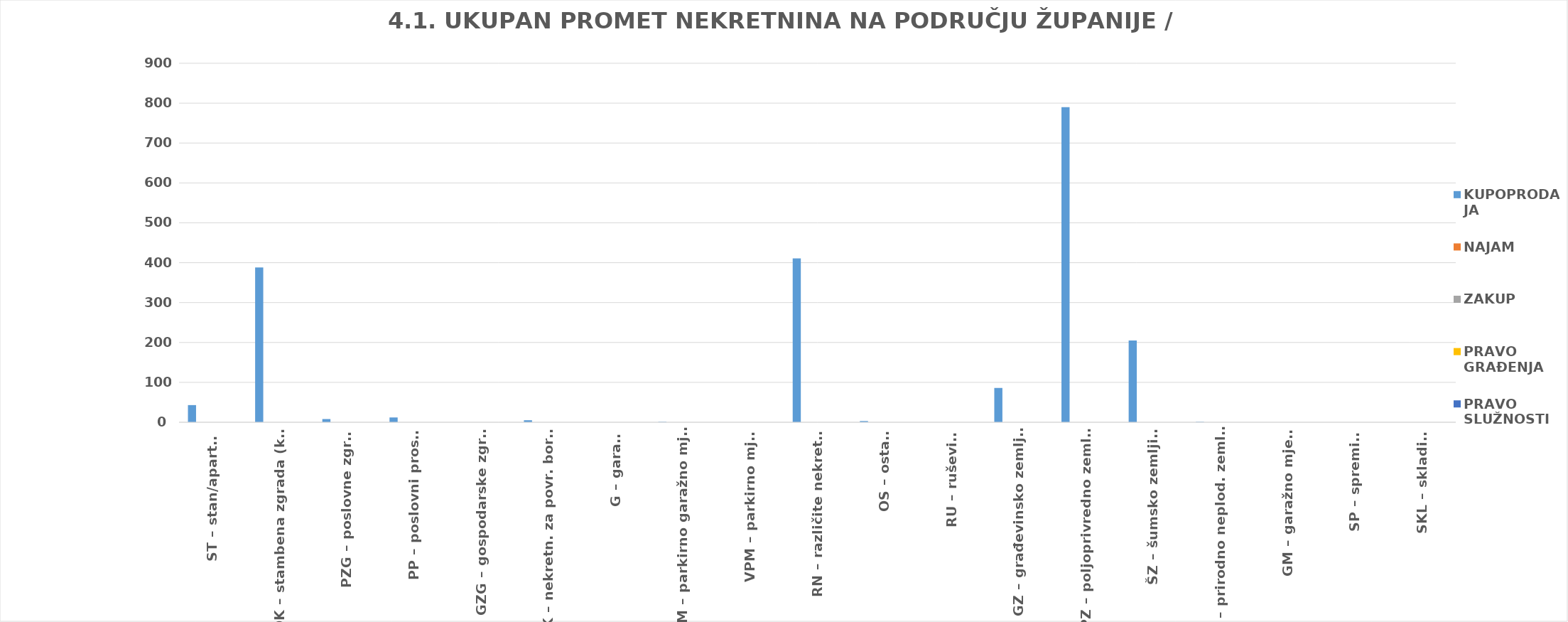
| Category | KUPOPRODAJA | NAJAM | ZAKUP | PRAVO GRAĐENJA | PRAVO SLUŽNOSTI |
|---|---|---|---|---|---|
| ST – stan/apartman | 43 | 0 | 0 | 0 | 0 |
| OK – stambena zgrada (kuća) | 388 | 0 | 0 | 0 | 0 |
| PZG – poslovne zgrade | 8 | 0 | 0 | 0 | 0 |
| PP – poslovni prostori | 12 | 0 | 0 | 0 | 0 |
| GZG – gospodarske zgrade | 0 | 0 | 0 | 0 | 0 |
| VIK – nekretn. za povr. boravak | 5 | 0 | 0 | 0 | 0 |
| G – garaža | 0 | 0 | 0 | 0 | 0 |
| PGM – parkirno garažno mjesto | 1 | 0 | 0 | 0 | 0 |
| VPM – parkirno mjesto | 0 | 0 | 0 | 0 | 0 |
| RN – različite nekretnine | 411 | 0 | 0 | 0 | 0 |
| OS – ostalo | 3 | 0 | 0 | 0 | 0 |
| RU – ruševine | 0 | 0 | 0 | 0 | 0 |
| GZ – građevinsko zemljište | 86 | 0 | 0 | 0 | 0 |
| PZ – poljoprivredno zemljište | 790 | 0 | 0 | 0 | 0 |
| ŠZ – šumsko zemljište | 205 | 0 | 0 | 0 | 0 |
| PNZ – prirodno neplod. zemljište | 1 | 0 | 0 | 0 | 0 |
| GM – garažno mjesto | 0 | 0 | 0 | 0 | 0 |
| SP – spremište | 0 | 0 | 0 | 0 | 0 |
| SKL – skladište | 0 | 0 | 0 | 0 | 0 |